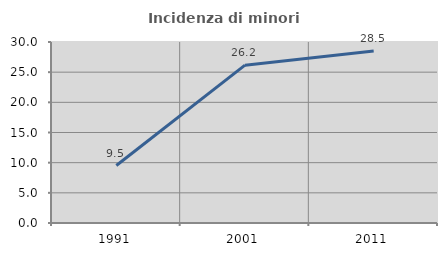
| Category | Incidenza di minori stranieri |
|---|---|
| 1991.0 | 9.524 |
| 2001.0 | 26.165 |
| 2011.0 | 28.508 |